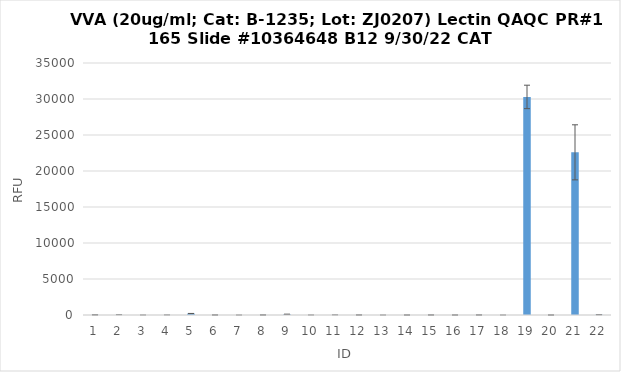
| Category | RFU |
|---|---|
| 0 | 23.75 |
| 1 | 15 |
| 2 | 1.25 |
| 3 | 5.75 |
| 4 | 205.25 |
| 5 | 6.25 |
| 6 | 0.25 |
| 7 | 9.25 |
| 8 | 93.75 |
| 9 | 3 |
| 10 | 8 |
| 11 | 6.75 |
| 12 | 0.25 |
| 13 | -1 |
| 14 | 7 |
| 15 | 1.5 |
| 16 | 7 |
| 17 | 0.5 |
| 18 | 30288 |
| 19 | 1 |
| 20 | 22591.25 |
| 21 | 51.5 |